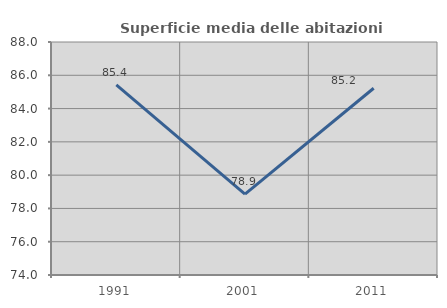
| Category | Superficie media delle abitazioni occupate |
|---|---|
| 1991.0 | 85.43 |
| 2001.0 | 78.864 |
| 2011.0 | 85.219 |